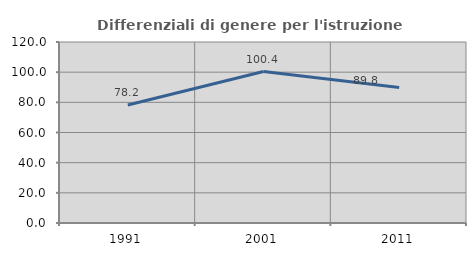
| Category | Differenziali di genere per l'istruzione superiore |
|---|---|
| 1991.0 | 78.189 |
| 2001.0 | 100.425 |
| 2011.0 | 89.779 |